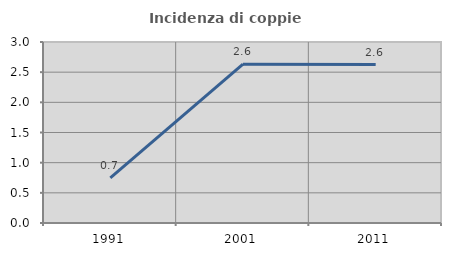
| Category | Incidenza di coppie miste |
|---|---|
| 1991.0 | 0.747 |
| 2001.0 | 2.632 |
| 2011.0 | 2.626 |